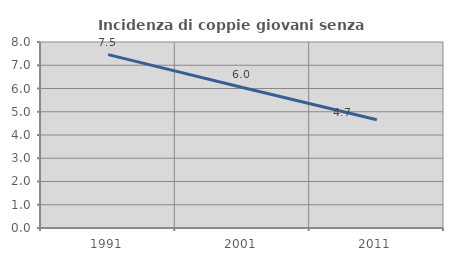
| Category | Incidenza di coppie giovani senza figli |
|---|---|
| 1991.0 | 7.458 |
| 2001.0 | 6.044 |
| 2011.0 | 4.653 |